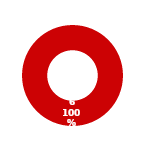
| Category | WM |
|---|---|
| MIL 1 Complete | 0 |
| MIL 1 Not Complete | 6 |